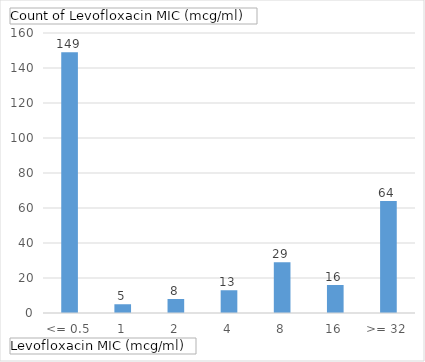
| Category | Total |
|---|---|
| <= 0.5 | 149 |
| 1 | 5 |
| 2 | 8 |
| 4 | 13 |
| 8 | 29 |
| 16 | 16 |
| >= 32 | 64 |